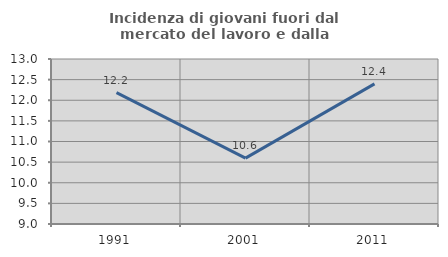
| Category | Incidenza di giovani fuori dal mercato del lavoro e dalla formazione  |
|---|---|
| 1991.0 | 12.183 |
| 2001.0 | 10.596 |
| 2011.0 | 12.397 |